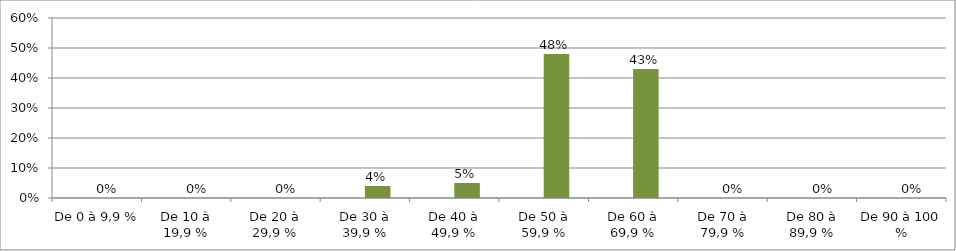
| Category | Series 0 | Series 1 |
|---|---|---|
| De 0 à 9,9 % |  | 0 |
| De 10 à 19,9 % |  | 0 |
| De 20 à 29,9 % |  | 0 |
| De 30 à 39,9 % |  | 0.04 |
| De 40 à 49,9 % |  | 0.05 |
| De 50 à 59,9 % |  | 0.48 |
| De 60 à 69,9 % |  | 0.43 |
| De 70 à 79,9 % |  | 0 |
| De 80 à 89,9 % |  | 0 |
| De 90 à 100 % |  | 0 |